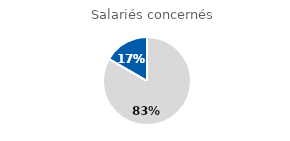
| Category | Series 0 |
|---|---|
| Non concernés | 0.833 |
| Concernés | 0.167 |